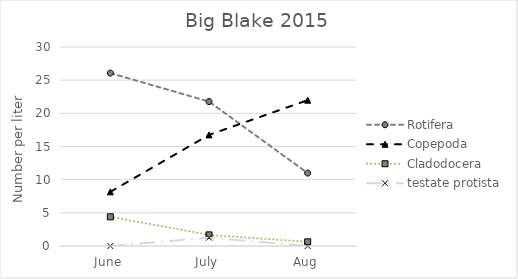
| Category | Rotifera | Copepoda | Cladodocera | testate protista |
|---|---|---|---|---|
| June | 26.066 | 8.165 | 4.397 | 0 |
| July | 21.774 | 16.749 | 1.675 | 1.256 |
| Aug | 10.992 | 21.984 | 0.628 | 0 |